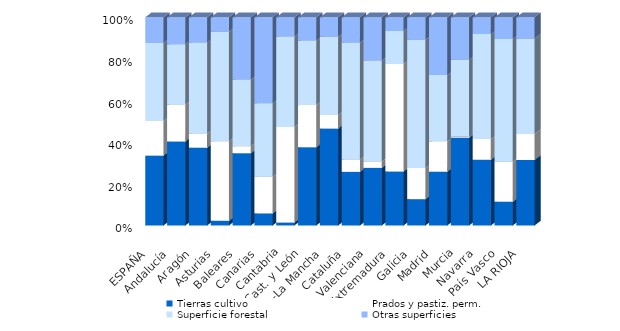
| Category | Tierras cultivo | Prados y pastiz. perm. | Superficie forestal | Otras superficies |
|---|---|---|---|---|
| ESPAÑA | 33.558 | 16.564 | 37.582 | 12.296 |
| Andalucía | 40.331 | 17.729 | 28.966 | 12.974 |
| Aragón | 37.345 | 6.783 | 43.732 | 12.14 |
| Asturias | 2.215 | 38.273 | 52.594 | 6.918 |
| Baleares | 34.712 | 3.34 | 32.019 | 29.929 |
| Canarias | 5.801 | 17.629 | 35.251 | 41.319 |
| Cantabria | 1.398 | 45.879 | 43.508 | 9.215 |
| Cast. y León | 37.581 | 20.226 | 31.042 | 11.151 |
| C.-La Mancha | 46.543 | 6.486 | 37.649 | 9.322 |
| Cataluña | 25.741 | 5.987 | 56.084 | 12.188 |
| C. Valenciana | 27.663 | 3.077 | 48.428 | 20.831 |
| Extremadura | 25.937 | 51.615 | 15.859 | 6.589 |
| Galicia | 12.641 | 14.97 | 61.578 | 10.811 |
| Madrid | 25.814 | 14.574 | 31.82 | 27.792 |
| Murcia | 42.14 | 0.574 | 36.923 | 20.364 |
| Navarra | 31.558 | 9.952 | 50.431 | 8.059 |
| País Vasco | 11.408 | 19.229 | 58.909 | 10.454 |
| LA RIOJA | 31.439 | 12.526 | 45.751 | 10.285 |